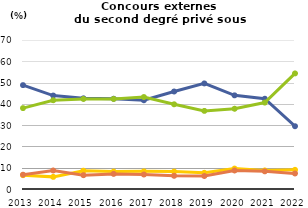
| Category | Étudiants | Enseignants et personnels d'éducation et de surveillance                            | Autres emplois dans secteurs public ou privé                | Sans emploi                    |
|---|---|---|---|---|
| 2013.0 | 48.8 | 38 | 6.5 | 6.7 |
| 2014.0 | 43.9 | 41.7 | 5.7 | 8.7 |
| 2015.0 | 42.6 | 42.3 | 8.6 | 6.5 |
| 2016.0 | 42.4 | 42.3 | 8.2 | 7.1 |
| 2017.0 | 41.7 | 43.2 | 8.3 | 6.8 |
| 2018.0 | 45.8 | 39.8 | 8.2 | 6.2 |
| 2019.0 | 49.6 | 36.7 | 7.6 | 6.1 |
| 2020.0 | 44 | 37.7 | 9.6 | 8.7 |
| 2021.0 | 42.4 | 40.6 | 8.7 | 8.3 |
| 2022.0 | 29.5 | 54.3 | 9 | 7.3 |